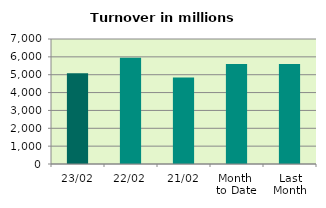
| Category | Series 0 |
|---|---|
| 23/02 | 5082.516 |
| 22/02 | 5956.193 |
| 21/02 | 4840.603 |
| Month 
to Date | 5604.386 |
| Last
Month | 5596.977 |